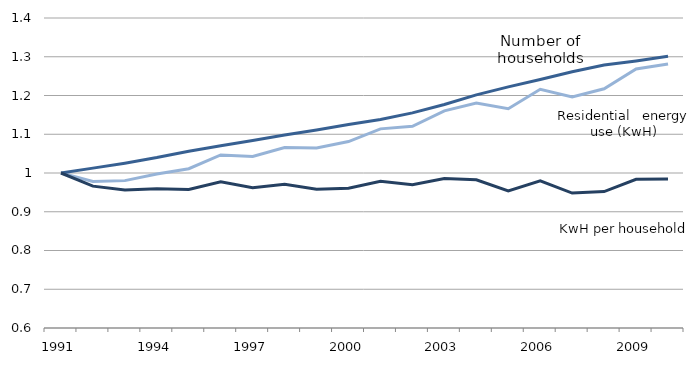
| Category | Residential energy use (Kwh) | Number of households | kWh per household |
|---|---|---|---|
| 1991.0 | 1 | 1 | 1 |
| 1992.0 | 0.978 | 1.013 | 0.966 |
| 1993.0 | 0.98 | 1.025 | 0.956 |
| 1994.0 | 0.998 | 1.04 | 0.959 |
| 1995.0 | 1.011 | 1.056 | 0.957 |
| 1996.0 | 1.046 | 1.07 | 0.978 |
| 1997.0 | 1.043 | 1.084 | 0.962 |
| 1998.0 | 1.066 | 1.098 | 0.971 |
| 1999.0 | 1.065 | 1.111 | 0.958 |
| 2000.0 | 1.081 | 1.125 | 0.961 |
| 2001.0 | 1.114 | 1.138 | 0.979 |
| 2002.0 | 1.12 | 1.155 | 0.97 |
| 2003.0 | 1.16 | 1.177 | 0.986 |
| 2004.0 | 1.181 | 1.202 | 0.982 |
| 2005.0 | 1.166 | 1.222 | 0.954 |
| 2006.0 | 1.216 | 1.241 | 0.98 |
| 2007.0 | 1.196 | 1.261 | 0.948 |
| 2008.0 | 1.217 | 1.279 | 0.952 |
| 2009.0 | 1.268 | 1.289 | 0.984 |
| 2010.0 | 1.281 | 1.301 | 0.985 |